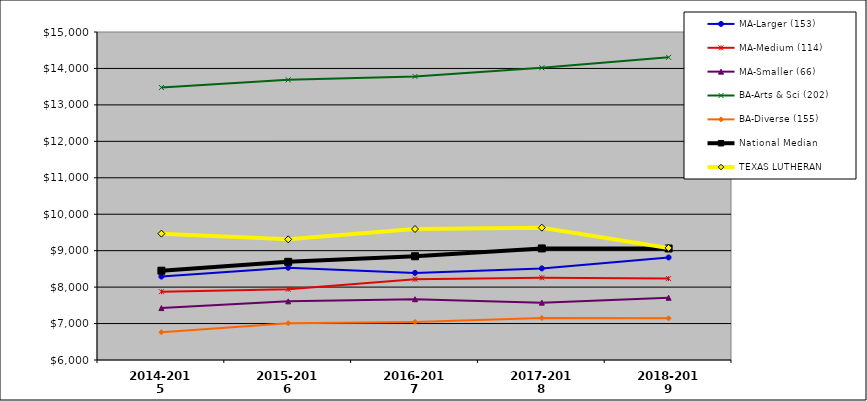
| Category | MA-Larger (153) | MA-Medium (114) | MA-Smaller (66) | BA-Arts & Sci (202) | BA-Diverse (155) | National Median | TEXAS LUTHERAN |
|---|---|---|---|---|---|---|---|
| 2014-2015 | 8290.023 | 7873.708 | 7424.641 | 13476.952 | 6762.102 | 8450.558 | 9467.017 |
| 2015-2016 | 8531.109 | 7943.686 | 7608.895 | 13686.763 | 7010.38 | 8693.909 | 9310.984 |
| 2016-2017 | 8390.59 | 8217.03 | 7668.007 | 13780.12 | 7044.168 | 8846.742 | 9594.193 |
| 2017-2018 | 8513.648 | 8256.079 | 7573.932 | 14016.626 | 7152.931 | 9061.41 | 9631.144 |
| 2018-2019 | 8813.192 | 8233.198 | 7706.832 | 14305.078 | 7143.449 | 9059.978 | 9075.626 |